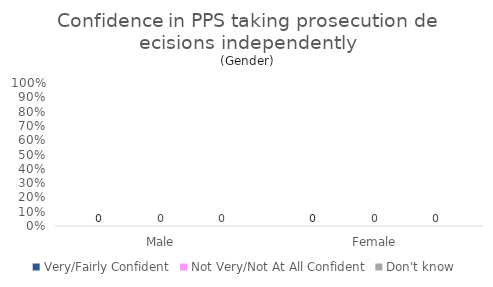
| Category | Very/Fairly Confident | Not Very/Not At All Confident | Don't know |
|---|---|---|---|
| Male | 0 | 0 | 0 |
| Female | 0 | 0 | 0 |